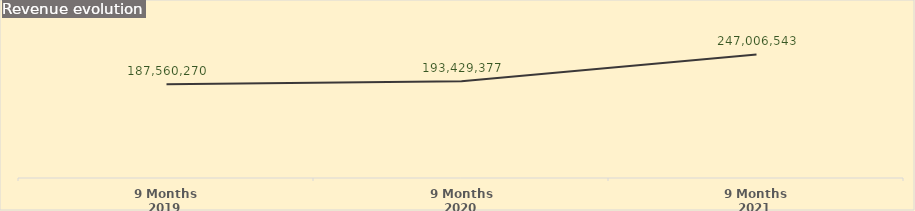
| Category | Series 1 |
|---|---|
| 9 Months 2019 | 187560270.351 |
| 9 Months 2020 | 193429377.019 |
| 9 Months 2021 | 247006542.936 |